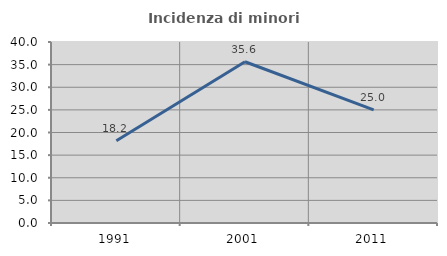
| Category | Incidenza di minori stranieri |
|---|---|
| 1991.0 | 18.182 |
| 2001.0 | 35.632 |
| 2011.0 | 25 |